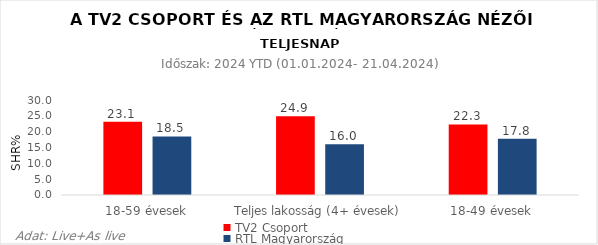
| Category | TV2 Csoport | RTL Magyarország |
|---|---|---|
| 18-59 évesek | 23.1 | 18.5 |
| Teljes lakosság (4+ évesek) | 24.9 | 16 |
| 18-49 évesek | 22.3 | 17.8 |